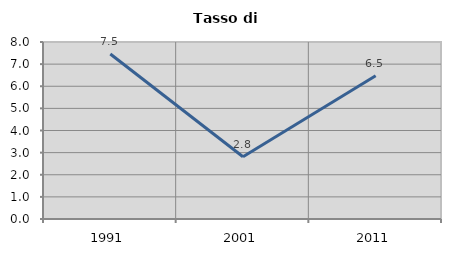
| Category | Tasso di disoccupazione   |
|---|---|
| 1991.0 | 7.459 |
| 2001.0 | 2.813 |
| 2011.0 | 6.476 |